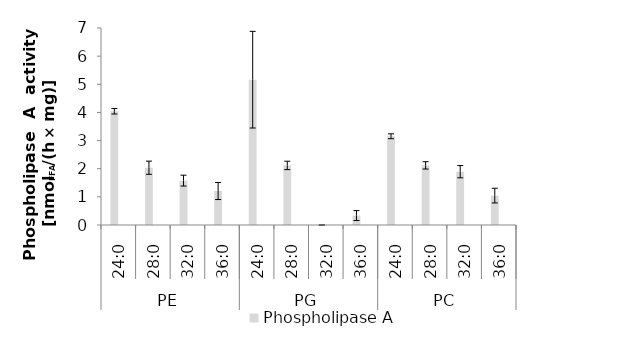
| Category | Phospholipase A | Series 1 |
|---|---|---|
| 0 | 4.041 |  |
| 1 | 2.035 |  |
| 2 | 1.577 |  |
| 3 | 1.207 |  |
| 4 | 5.164 |  |
| 5 | 2.118 |  |
| 6 | 0 |  |
| 7 | 0.335 |  |
| 8 | 3.153 |  |
| 9 | 2.119 |  |
| 10 | 1.894 |  |
| 11 | 1.044 |  |